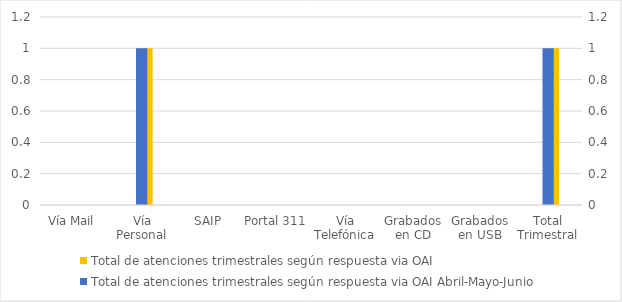
| Category | Total de atenciones trimestrales según respuesta via OAI | Series 2 | Series 4 |
|---|---|---|---|
| Vía Mail | 0 |  |  |
| Vía Personal | 1 |  |  |
| SAIP | 0 |  |  |
| Portal 311 | 0 |  |  |
| Vía Telefónica | 0 |  |  |
| Grabados en CD | 0 |  |  |
| Grabados en USB | 0 |  |  |
| Total Trimestral | 1 |  |  |